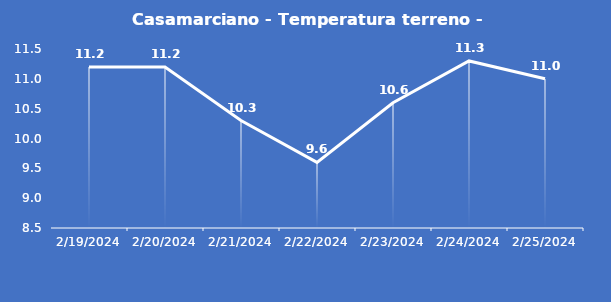
| Category | Casamarciano - Temperatura terreno - Grezzo (°C) |
|---|---|
| 2/19/24 | 11.2 |
| 2/20/24 | 11.2 |
| 2/21/24 | 10.3 |
| 2/22/24 | 9.6 |
| 2/23/24 | 10.6 |
| 2/24/24 | 11.3 |
| 2/25/24 | 11 |